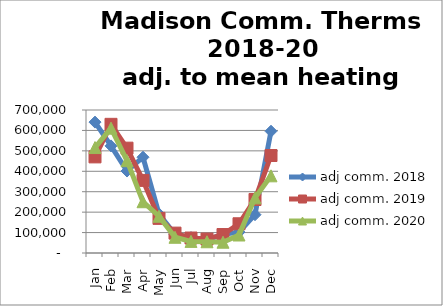
| Category | adj comm. 2018 | adj comm. 2019 | adj comm. 2020 |
|---|---|---|---|
| Jan | 640653.485 | 470532.013 | 516179.874 |
| Feb | 524299.547 | 629841.095 | 611074.213 |
| Mar | 401181.22 | 513178.214 | 451831.704 |
| Apr | 468850.095 | 355426.075 | 250988.517 |
| May | 191150.683 | 169545.646 | 179908.875 |
| Jun | 91062.189 | 97340.126 | 76913.707 |
| Jul | 75392 | 73297 | 56867.052 |
| Aug | 65459 | 68257 | 55062.795 |
| Sep | 91289.994 | 90354.748 | 52727.97 |
| Oct | 102247.47 | 143093.57 | 88056.466 |
| Nov | 187455.963 | 261895.472 | 269858.004 |
| Dec | 596034.656 | 477228.744 | 377825.286 |